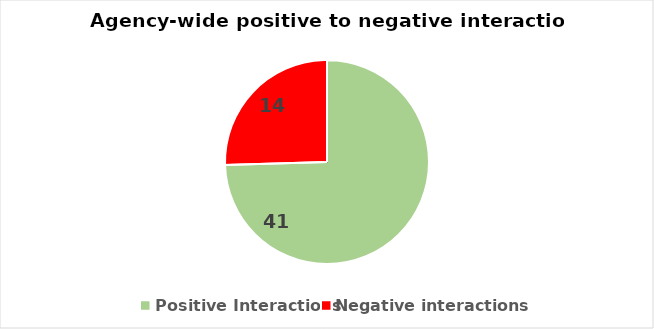
| Category | Interaction type |
|---|---|
| Positive Interactions | 41 |
| Negative interactions | 14 |